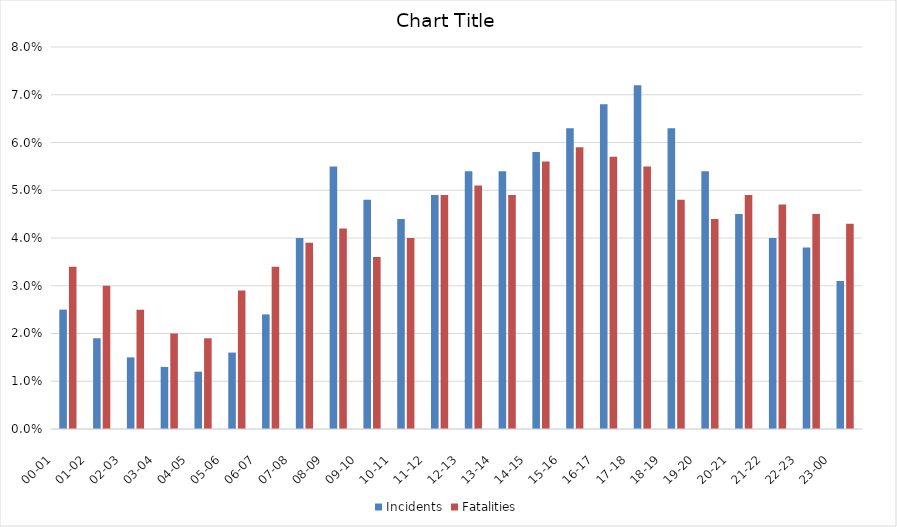
| Category | Incidents | Fatalities |
|---|---|---|
| 00-01      | 0.025 | 0.034 |
| 01-02      | 0.019 | 0.03 |
| 02-03      | 0.015 | 0.025 |
| 03-04      | 0.013 | 0.02 |
| 04-05      | 0.012 | 0.019 |
| 05-06      | 0.016 | 0.029 |
| 06-07      | 0.024 | 0.034 |
| 07-08      | 0.04 | 0.039 |
| 08-09      | 0.055 | 0.042 |
| 09-10      | 0.048 | 0.036 |
| 10-11      | 0.044 | 0.04 |
| 11-12      | 0.049 | 0.049 |
| 12-13      | 0.054 | 0.051 |
| 13-14      | 0.054 | 0.049 |
| 14-15      | 0.058 | 0.056 |
| 15-16      | 0.063 | 0.059 |
| 16-17      | 0.068 | 0.057 |
| 17-18      | 0.072 | 0.055 |
| 18-19      | 0.063 | 0.048 |
| 19-20      | 0.054 | 0.044 |
| 20-21      | 0.045 | 0.049 |
| 21-22      | 0.04 | 0.047 |
| 22-23      | 0.038 | 0.045 |
| 23-00      | 0.031 | 0.043 |